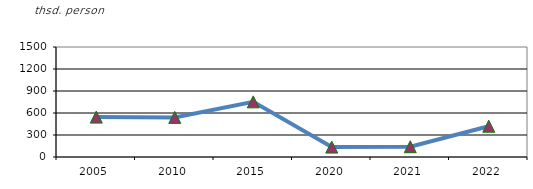
| Category | min nəfər |
|---|---|
| 2005.0 | 544 |
| 2010.0 | 540 |
| 2015.0 | 752 |
| 2020.0 | 135 |
| 2021.0 | 140 |
| 2022.0 | 420 |